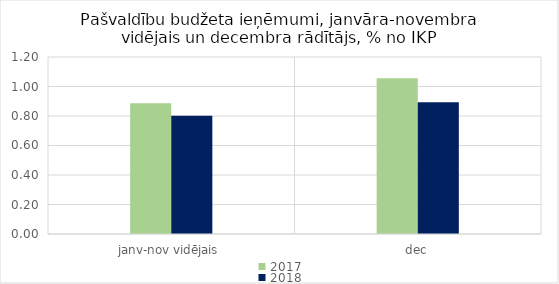
| Category | 2017 | 2018 |
|---|---|---|
| janv-nov vidējais | 0.886 | 0.801 |
| dec | 1.056 | 0.894 |